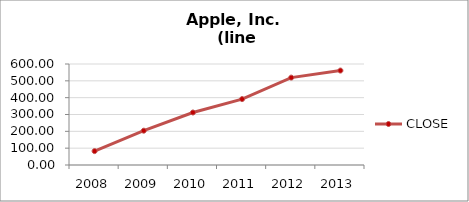
| Category | CLOSE |
|---|---|
| 2008.0 | 82.53 |
| 2009.0 | 203.76 |
| 2010.0 | 311.89 |
| 2011.0 | 391.6 |
| 2012.0 | 519.13 |
| 2013.0 | 561.02 |